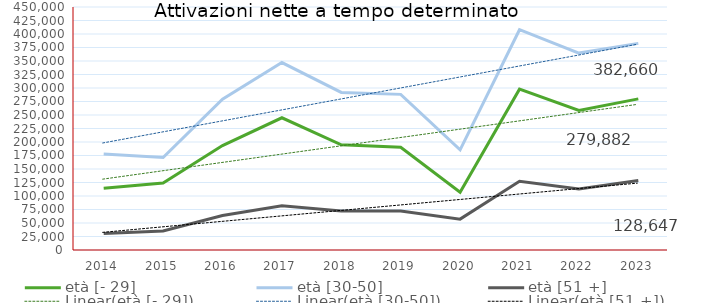
| Category | età [- 29] | età [30-50] | età [51 +] |
|---|---|---|---|
| 2014.0 | 114176 | 177713 | 30337 |
| 2015.0 | 123863 | 171162 | 35389 |
| 2016.0 | 193325 | 279416 | 63762 |
| 2017.0 | 244869 | 347116 | 82037 |
| 2018.0 | 194709 | 291791 | 72392 |
| 2019.0 | 190132 | 288221 | 72400 |
| 2020.0 | 107053 | 185561 | 57150 |
| 2021.0 | 297854 | 407915 | 127262 |
| 2022.0 | 258510 | 364663 | 112900 |
| 2023.0 | 279882 | 382660 | 128647 |